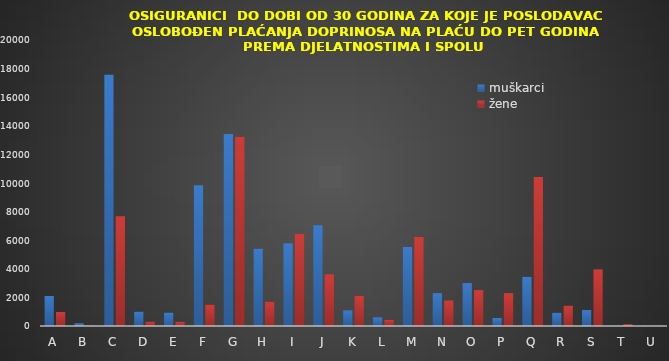
| Category | muškarci | žene |
|---|---|---|
| A | 2100 | 982 |
| B | 191 | 23 |
| C | 17581 | 7673 |
| D | 999 | 296 |
| E | 941 | 297 |
| F | 9847 | 1498 |
| G | 13423 | 13232 |
| H | 5419 | 1704 |
| I | 5776 | 6435 |
| J | 7039 | 3614 |
| K | 1094 | 2129 |
| L | 608 | 422 |
| M | 5527 | 6239 |
| N | 2296 | 1783 |
| O | 3002 | 2511 |
| P | 561 | 2301 |
| Q | 3439 | 10413 |
| R | 926 | 1424 |
| S | 1113 | 3960 |
| T | 17 | 125 |
| U | 10 | 12 |